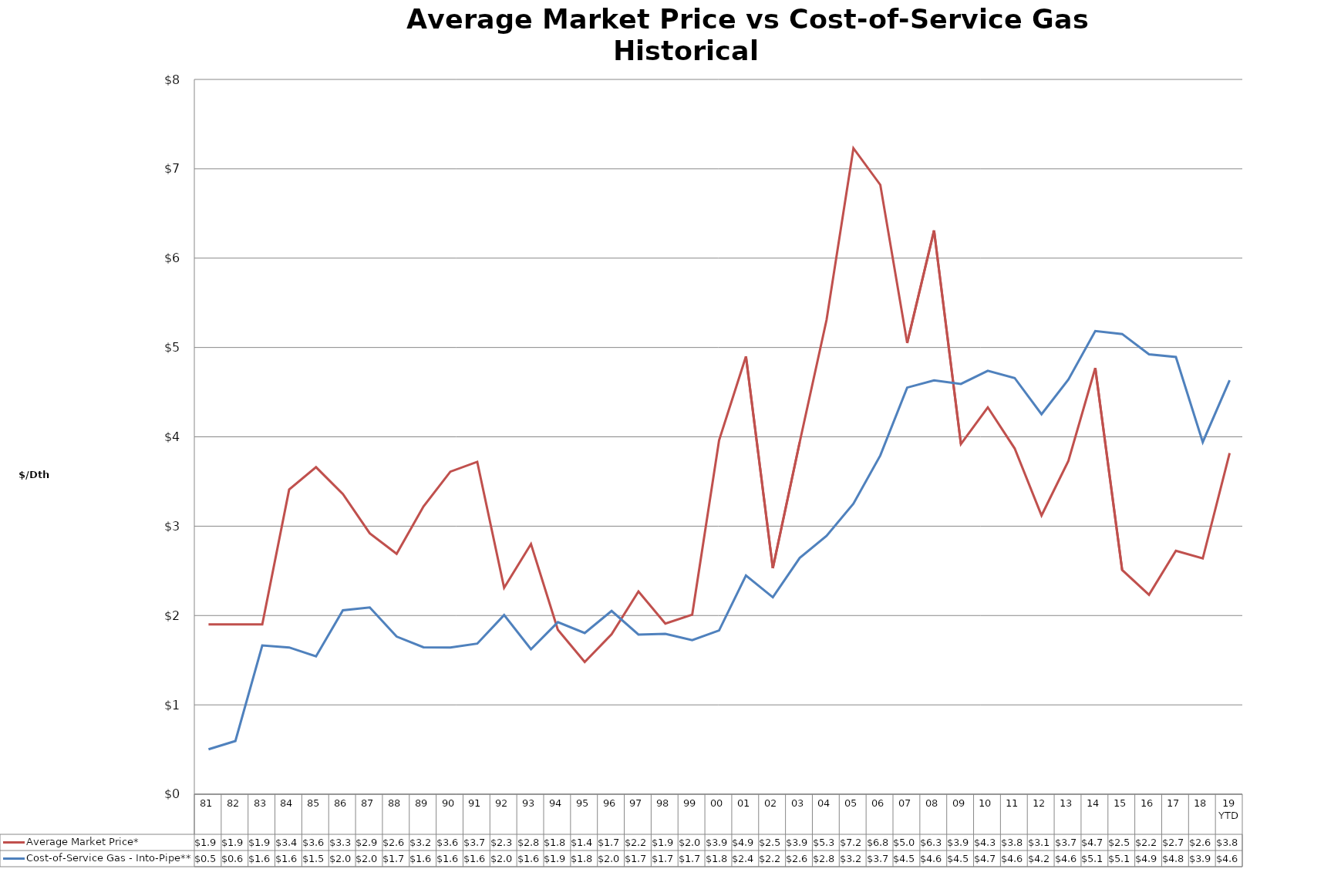
| Category | Average Market Price* | Cost-of-Service Gas - Into-Pipe** |
|---|---|---|
| 81 | 1.9 | 0.502 |
| 82 | 1.9 | 0.596 |
| 83 | 1.9 | 1.665 |
| 84 | 3.41 | 1.643 |
| 85 | 3.66 | 1.543 |
| 86 | 3.36 | 2.059 |
| 87 | 2.92 | 2.091 |
| 88 | 2.69 | 1.764 |
| 89 | 3.22 | 1.644 |
| 90 | 3.61 | 1.642 |
| 91 | 3.72 | 1.685 |
| 92 | 2.31 | 2.005 |
| 93 | 2.8 | 1.623 |
| 94 | 1.84 | 1.926 |
| 95 | 1.48 | 1.804 |
| 96 | 1.79 | 2.052 |
| 97 | 2.27 | 1.787 |
| 98 | 1.91 | 1.795 |
| 99 | 2.01 | 1.725 |
| 00 | 3.96 | 1.833 |
| 01 | 4.9 | 2.448 |
| 02 | 2.53 | 2.204 |
| 03 | 3.94 | 2.644 |
| 04 | 5.31 | 2.891 |
| 05 | 7.23 | 3.251 |
| 06 | 6.82 | 3.792 |
| 07 | 5.05 | 4.551 |
| 08 | 6.31 | 4.632 |
| 09 | 3.92 | 4.592 |
| 10 | 4.33 | 4.74 |
| 11 | 3.87 | 4.658 |
| 12 | 3.12 | 4.253 |
| 13 | 3.73 | 4.641 |
| 14 | 4.77 | 5.184 |
| 15 | 2.51 | 5.151 |
| 16 | 2.233 | 4.923 |
| 17 | 2.725 | 4.894 |
| 18 | 2.639 | 3.94 |
| 19 YTD | 3.817 | 4.634 |